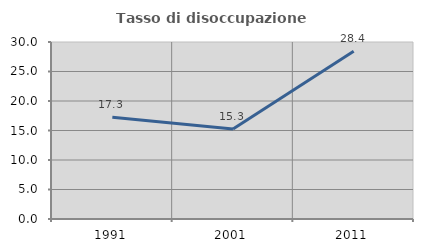
| Category | Tasso di disoccupazione giovanile  |
|---|---|
| 1991.0 | 17.255 |
| 2001.0 | 15.267 |
| 2011.0 | 28.421 |